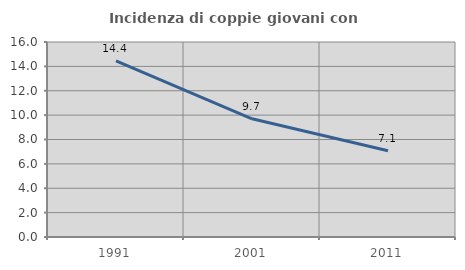
| Category | Incidenza di coppie giovani con figli |
|---|---|
| 1991.0 | 14.444 |
| 2001.0 | 9.697 |
| 2011.0 | 7.073 |